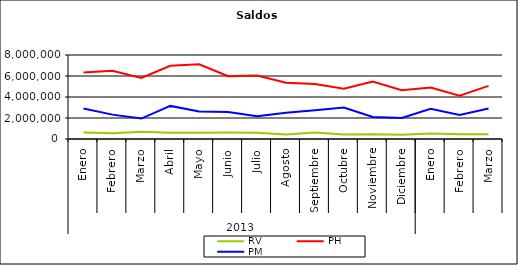
| Category | RV | PH | PM |
|---|---|---|---|
| 0 | 625726.624 | 6338490.057 | 2894951.851 |
| 1 | 552164.14 | 6505711.807 | 2320902.81 |
| 2 | 684317.675 | 5822855.149 | 1948127.804 |
| 3 | 601474.166 | 6976391.987 | 3151453.143 |
| 4 | 590050.657 | 7107878.906 | 2620515.735 |
| 5 | 624993.58 | 5975534.656 | 2574055.31 |
| 6 | 600696.535 | 6050025.472 | 2173848.831 |
| 7 | 419012.816 | 5367684.924 | 2503871.717 |
| 8 | 611730.758 | 5247250.768 | 2727549.288 |
| 9 | 419155.215 | 4784420.625 | 2990459.774 |
| 10 | 447319.577 | 5481772.72 | 2092491.866 |
| 11 | 408611.698 | 4646492.747 | 1999878.157 |
| 12 | 527889.485 | 4912075.273 | 2877652.76 |
| 13 | 454567.098 | 4120538.063 | 2278357.683 |
| 14 | 451499.2 | 5057360.029 | 2895505.472 |